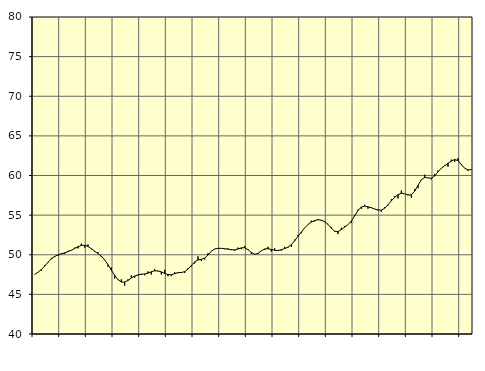
| Category | Piggar | Samtliga anställda (inkl. anställda utomlands) |
|---|---|---|
| nan | 47.5 | 47.51 |
| 87.0 | 47.8 | 47.79 |
| 87.0 | 48 | 48.13 |
| 87.0 | 48.7 | 48.57 |
| nan | 49 | 49.06 |
| 88.0 | 49.6 | 49.48 |
| 88.0 | 49.7 | 49.79 |
| 88.0 | 49.9 | 49.98 |
| nan | 50.2 | 50.11 |
| 89.0 | 50.1 | 50.24 |
| 89.0 | 50.5 | 50.4 |
| 89.0 | 50.6 | 50.57 |
| nan | 50.9 | 50.79 |
| 90.0 | 50.8 | 51.02 |
| 90.0 | 51.4 | 51.17 |
| 90.0 | 50.9 | 51.2 |
| nan | 51.3 | 51.05 |
| 91.0 | 50.7 | 50.76 |
| 91.0 | 50.4 | 50.45 |
| 91.0 | 50.3 | 50.17 |
| nan | 49.7 | 49.82 |
| 92.0 | 49.4 | 49.34 |
| 92.0 | 48.5 | 48.75 |
| 92.0 | 48.4 | 48.06 |
| nan | 47 | 47.39 |
| 93.0 | 46.9 | 46.86 |
| 93.0 | 46.9 | 46.56 |
| 93.0 | 46.1 | 46.55 |
| nan | 46.9 | 46.75 |
| 94.0 | 47.4 | 47.07 |
| 94.0 | 47.1 | 47.32 |
| 94.0 | 47.5 | 47.44 |
| nan | 47.6 | 47.53 |
| 95.0 | 47.4 | 47.58 |
| 95.0 | 47.9 | 47.67 |
| 95.0 | 47.5 | 47.86 |
| nan | 48.2 | 47.97 |
| 96.0 | 47.9 | 47.96 |
| 96.0 | 47.5 | 47.84 |
| 96.0 | 48.1 | 47.64 |
| nan | 47.3 | 47.5 |
| 97.0 | 47.3 | 47.47 |
| 97.0 | 47.8 | 47.61 |
| 97.0 | 47.8 | 47.74 |
| nan | 47.7 | 47.76 |
| 98.0 | 47.7 | 47.87 |
| 98.0 | 48.3 | 48.18 |
| 98.0 | 48.5 | 48.64 |
| nan | 48.9 | 49.1 |
| 99.0 | 49.8 | 49.35 |
| 99.0 | 49.2 | 49.42 |
| 99.0 | 49.4 | 49.58 |
| nan | 50.2 | 49.97 |
| 0.0 | 50.5 | 50.45 |
| 0.0 | 50.7 | 50.73 |
| 0.0 | 50.8 | 50.81 |
| nan | 50.8 | 50.81 |
| 1.0 | 50.7 | 50.76 |
| 1.0 | 50.8 | 50.71 |
| 1.0 | 50.7 | 50.63 |
| nan | 50.5 | 50.62 |
| 2.0 | 50.9 | 50.72 |
| 2.0 | 50.7 | 50.87 |
| 2.0 | 51.1 | 50.89 |
| nan | 50.7 | 50.64 |
| 3.0 | 50.1 | 50.29 |
| 3.0 | 50.1 | 50.06 |
| 3.0 | 50.1 | 50.17 |
| nan | 50.5 | 50.49 |
| 4.0 | 50.6 | 50.73 |
| 4.0 | 51 | 50.76 |
| 4.0 | 50.4 | 50.67 |
| nan | 50.8 | 50.56 |
| 5.0 | 50.6 | 50.53 |
| 5.0 | 50.5 | 50.64 |
| 5.0 | 51 | 50.78 |
| nan | 50.9 | 50.96 |
| 6.0 | 51 | 51.27 |
| 6.0 | 51.9 | 51.76 |
| 6.0 | 52.5 | 52.33 |
| nan | 52.7 | 52.86 |
| 7.0 | 53.4 | 53.39 |
| 7.0 | 53.8 | 53.82 |
| 7.0 | 54.3 | 54.12 |
| nan | 54.2 | 54.32 |
| 8.0 | 54.5 | 54.42 |
| 8.0 | 54.3 | 54.36 |
| 8.0 | 54.1 | 54.18 |
| nan | 53.9 | 53.84 |
| 9.0 | 53.5 | 53.35 |
| 9.0 | 52.9 | 52.97 |
| 9.0 | 52.6 | 52.92 |
| nan | 53.4 | 53.17 |
| 10.0 | 53.6 | 53.49 |
| 10.0 | 53.8 | 53.8 |
| 10.0 | 54 | 54.25 |
| nan | 55 | 54.9 |
| 11.0 | 55.7 | 55.58 |
| 11.0 | 55.8 | 56.02 |
| 11.0 | 56.3 | 56.12 |
| nan | 55.8 | 56.05 |
| 12.0 | 56 | 55.93 |
| 12.0 | 55.8 | 55.77 |
| 12.0 | 55.6 | 55.65 |
| nan | 55.4 | 55.63 |
| 13.0 | 56 | 55.86 |
| 13.0 | 56.2 | 56.3 |
| 13.0 | 57 | 56.8 |
| nan | 57.4 | 57.25 |
| 14.0 | 57.1 | 57.58 |
| 14.0 | 58.1 | 57.77 |
| 14.0 | 57.7 | 57.7 |
| nan | 57.6 | 57.53 |
| 15.0 | 57.2 | 57.57 |
| 15.0 | 58.3 | 58.02 |
| 15.0 | 58.4 | 58.75 |
| nan | 59.5 | 59.46 |
| 16.0 | 60.1 | 59.75 |
| 16.0 | 59.7 | 59.7 |
| 16.0 | 59.5 | 59.66 |
| nan | 60.2 | 59.93 |
| 17.0 | 60.6 | 60.46 |
| 17.0 | 60.9 | 60.92 |
| 17.0 | 61.3 | 61.23 |
| nan | 61.1 | 61.53 |
| 18.0 | 62 | 61.83 |
| 18.0 | 61.7 | 62.02 |
| 18.0 | 62.2 | 61.87 |
| nan | 61.3 | 61.4 |
| 19.0 | 60.9 | 60.92 |
| 19.0 | 60.6 | 60.7 |
| 19.0 | 60.8 | 60.74 |